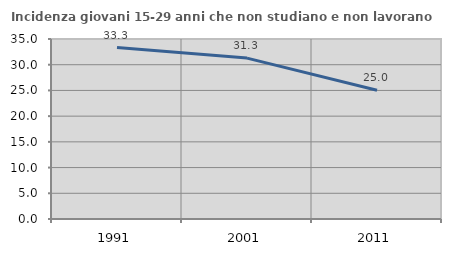
| Category | Incidenza giovani 15-29 anni che non studiano e non lavorano  |
|---|---|
| 1991.0 | 33.333 |
| 2001.0 | 31.284 |
| 2011.0 | 25.036 |